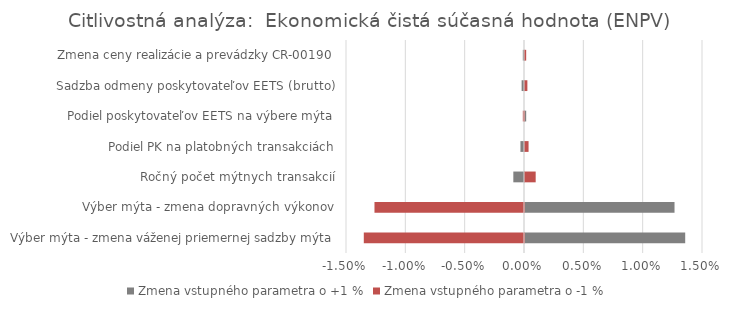
| Category | Zmena vstupného parametra o +1 % | Zmena vstupného parametra o -1 % |
|---|---|---|
| Výber mýta - zmena váženej priemernej sadzby mýta | 0.014 | -0.014 |
| Výber mýta - zmena dopravných výkonov | 0.013 | -0.013 |
| Ročný počet mýtnych transakcií | -0.001 | 0.001 |
| Podiel PK na platobných transakciách | 0 | 0 |
| Podiel poskytovateľov EETS na výbere mýta | 0 | 0 |
| Sadzba odmeny poskytovateľov EETS (brutto) | 0 | 0 |
| Zmena ceny realizácie a prevádzky CR-00190 | 0 | 0 |